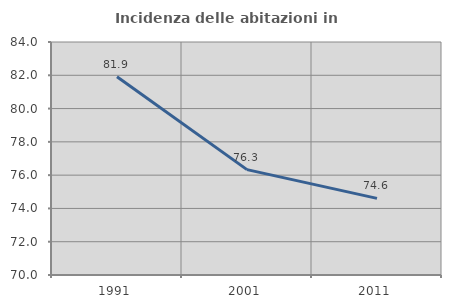
| Category | Incidenza delle abitazioni in proprietà  |
|---|---|
| 1991.0 | 81.917 |
| 2001.0 | 76.331 |
| 2011.0 | 74.604 |